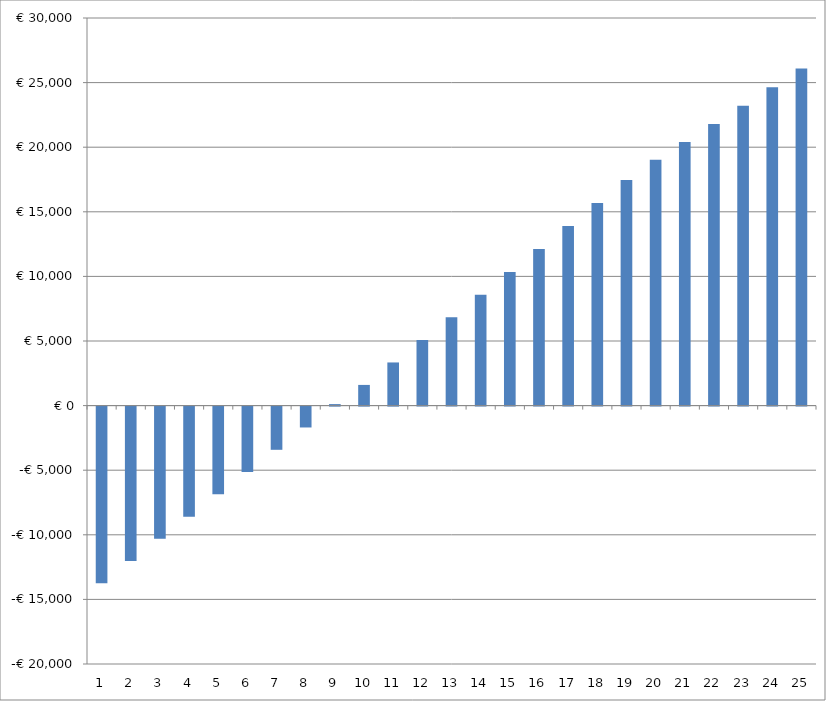
| Category | Series 0 |
|---|---|
| 0 | -13680.871 |
| 1 | -11959.345 |
| 2 | -10237.945 |
| 3 | -8516.185 |
| 4 | -6793.565 |
| 5 | -5069.58 |
| 6 | -3343.709 |
| 7 | -1615.421 |
| 8 | 115.826 |
| 9 | 1600.589 |
| 10 | 3339.434 |
| 11 | 5082.945 |
| 12 | 6831.716 |
| 13 | 8586.356 |
| 14 | 10347.49 |
| 15 | 12115.757 |
| 16 | 13891.811 |
| 17 | 15676.323 |
| 18 | 17469.981 |
| 19 | 19023.491 |
| 20 | 20403.269 |
| 21 | 21798.27 |
| 22 | 23209.218 |
| 23 | 24636.86 |
| 24 | 26081.958 |